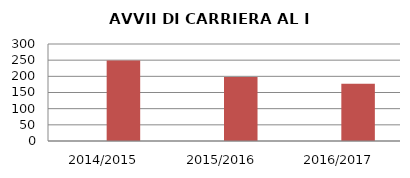
| Category | ANNO | NUMERO |
|---|---|---|
| 2014/2015 | 0 | 249 |
| 2015/2016 | 0 | 198 |
| 2016/2017 | 0 | 177 |